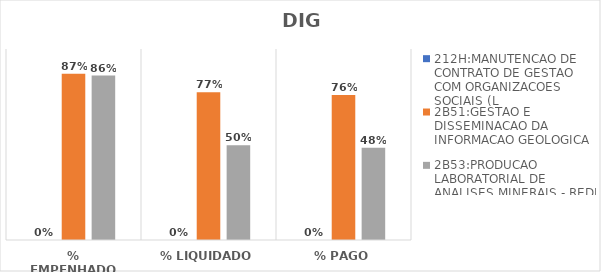
| Category | 212H:MANUTENCAO DE CONTRATO DE GESTAO COM ORGANIZACOES SOCIAIS (L | 2B51:GESTAO E DISSEMINACAO DA INFORMACAO GEOLOGICA | 2B53:PRODUCAO LABORATORIAL DE ANALISES MINERAIS - REDE LAMIN |
|---|---|---|---|
| % EMPENHADO | 0 | 0.871 | 0.861 |
| % LIQUIDADO | 0 | 0.773 | 0.496 |
| % PAGO | 0 | 0.759 | 0.484 |